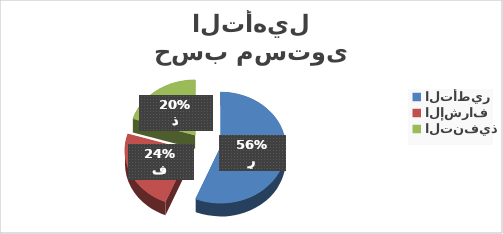
| Category | إناث |
|---|---|
| التأطير | 50 |
| الإشراف | 21 |
| التنفيذ | 18 |